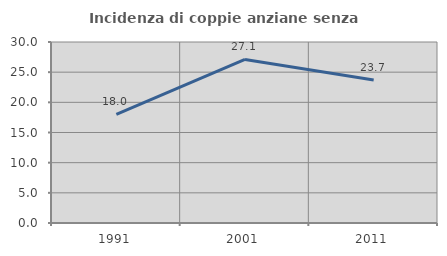
| Category | Incidenza di coppie anziane senza figli  |
|---|---|
| 1991.0 | 18.02 |
| 2001.0 | 27.105 |
| 2011.0 | 23.692 |